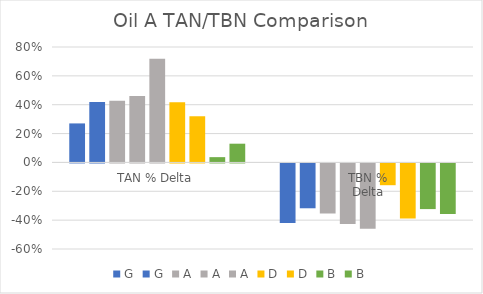
| Category | G | A | D | B |
|---|---|---|---|---|
| TAN % Delta | 0.418 | 0.719 | 0.32 | 0.13 |
| TBN %
Delta | -0.311 | -0.452 | -0.382 | -0.351 |